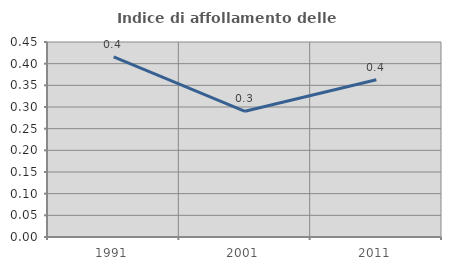
| Category | Indice di affollamento delle abitazioni  |
|---|---|
| 1991.0 | 0.416 |
| 2001.0 | 0.29 |
| 2011.0 | 0.363 |